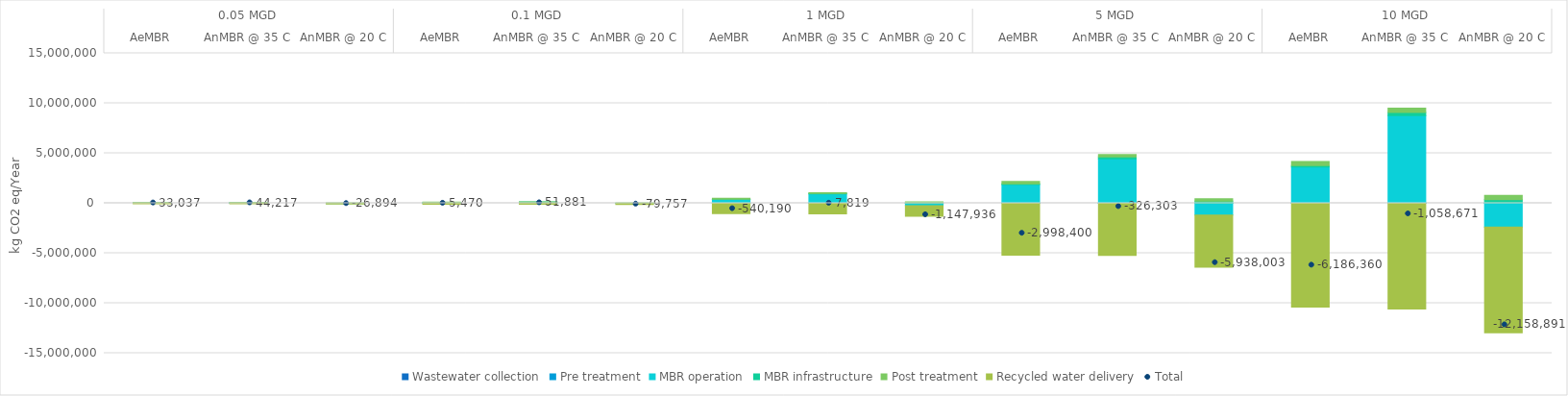
| Category | Wastewater collection | Pre treatment | MBR operation | MBR infrastructure | Post treatment | Recycled water delivery |
|---|---|---|---|---|---|---|
| 0 | 17.267 | 2803.327 | 47872.26 | 1054.71 | 33166 | -51877.064 |
| 1 | 17.267 | 2803.327 | 57667.6 | 3293 | 33166 | -52730.5 |
| 2 | 17.267 | 2803.327 | -13442.959 | 3293 | 33166 | -52730.5 |
| 3 | 35.909 | 3903.609 | 67029.3 | 1857.29 | 39466 | -106822.14 |
| 4 | 35.909 | 3903.609 | 108668 | 3475 | 39466 | -103668 |
| 5 | 35.909 | 3903.609 | -22969.476 | 3475 | 39466 | -103668 |
| 6 | 347.92 | 12355.95 | 378479 | 15779.8 | 90494 | -1037646.67 |
| 7 | 347.92 | 12355.95 | 920852.7 | 42772.4 | 90494 | -1059004 |
| 8 | 347.92 | 12355.95 | -234902.075 | 42772.4 | 90494 | -1059004 |
| 9 | 1758.78 | 30123.72 | 1840889 | 70429.8 | 245966 | -5187567.3 |
| 10 | 1758.78 | 30123.72 | 4424834.7 | 178294 | 245966 | -5207280 |
| 11 | 1758.78 | 30123.72 | -1186865.1 | 178294 | 245966 | -5207280 |
| 12 | 3701.92 | 45957 | 3575700 | 138680 | 424896 | -10375294.92 |
| 13 | 3701.92 | 45957 | 8714136 | 320777.78 | 424896 | -10568139.3 |
| 14 | 3701.92 | 45957 | -2386084.7 | 320777.78 | 424896 | -10568139.3 |